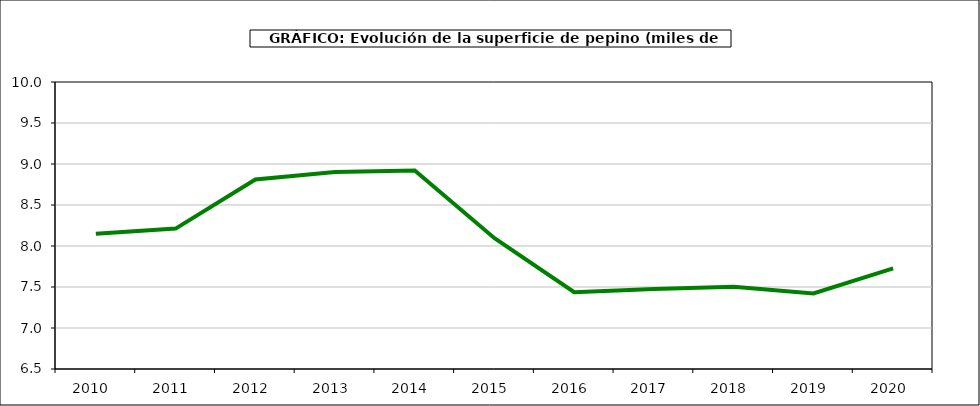
| Category | superficie |
|---|---|
| 2010.0 | 8.148 |
| 2011.0 | 8.212 |
| 2012.0 | 8.811 |
| 2013.0 | 8.902 |
| 2014.0 | 8.921 |
| 2015.0 | 8.095 |
| 2016.0 | 7.437 |
| 2017.0 | 7.475 |
| 2018.0 | 7.503 |
| 2019.0 | 7.422 |
| 2020.0 | 7.728 |